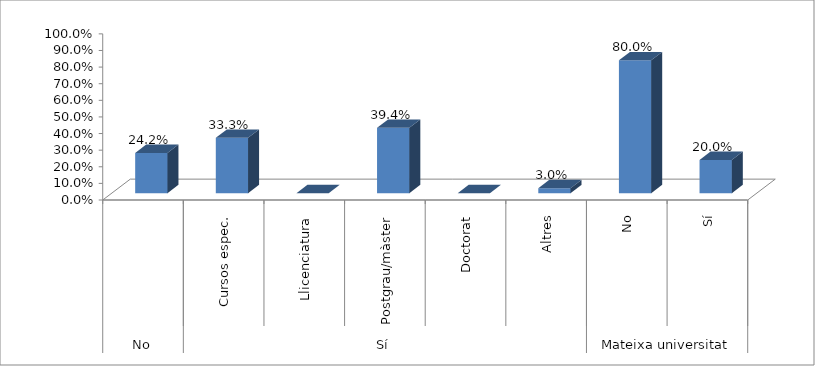
| Category | ARQUITECTURA |
|---|---|
| 0 | 0.242 |
| 1 | 0.333 |
| 2 | 0 |
| 3 | 0.394 |
| 4 | 0 |
| 5 | 0.03 |
| 6 | 0.8 |
| 7 | 0.2 |